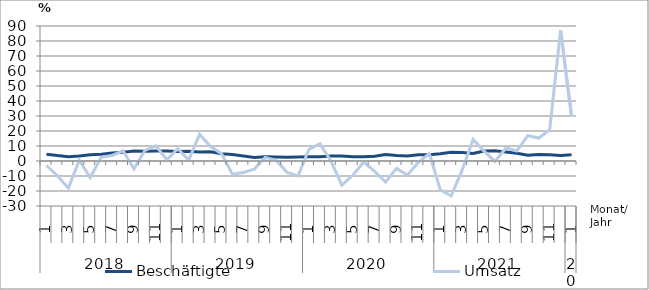
| Category | Beschäftigte | Umsatz |
|---|---|---|
| 0 | 4.5 | -3 |
| 1 | 3.6 | -9.8 |
| 2 | 2.9 | -18.1 |
| 3 | 3.4 | 0.5 |
| 4 | 4.2 | -11 |
| 5 | 4.5 | 2.5 |
| 6 | 5.3 | 3.7 |
| 7 | 5.8 | 6.8 |
| 8 | 6.6 | -5.2 |
| 9 | 6.5 | 7.1 |
| 10 | 6.6 | 10.1 |
| 11 | 6.6 | 0.8 |
| 12 | 6.4 | 8.2 |
| 13 | 6.5 | 0.6 |
| 14 | 6 | 17.8 |
| 15 | 6.1 | 9.6 |
| 16 | 4.9 | 4.9 |
| 17 | 4.3 | -8.8 |
| 18 | 3.3 | -7.7 |
| 19 | 2.4 | -5.4 |
| 20 | 2.8 | 2.4 |
| 21 | 2.7 | 0.5 |
| 22 | 2.5 | -7.6 |
| 23 | 2.7 | -10 |
| 24 | 2.9 | 7.8 |
| 25 | 2.9 | 11.5 |
| 26 | 3.4 | 0.1 |
| 27 | 3.4 | -16.1 |
| 28 | 2.9 | -9.5 |
| 29 | 2.9 | -0.8 |
| 30 | 3.1 | -6.9 |
| 31 | 4.3 | -14 |
| 32 | 3.6 | -4.9 |
| 33 | 3.4 | -9.4 |
| 34 | 4.1 | -0.9 |
| 35 | 4.1 | 4.9 |
| 36 | 4.8 | -19.1 |
| 37 | 5.8 | -23.3 |
| 38 | 5.6 | -6.1 |
| 39 | 5 | 14.4 |
| 40 | 6.6 | 6.6 |
| 41 | 6.9 | -0.3 |
| 42 | 6 | 8.7 |
| 43 | 5.2 | 6.7 |
| 44 | 3.8 | 16.9 |
| 45 | 4.3 | 15.3 |
| 46 | 4.2 | 20.7 |
| 47 | 3.6 | 87.2 |
| 48 | 4.1 | 29.8 |